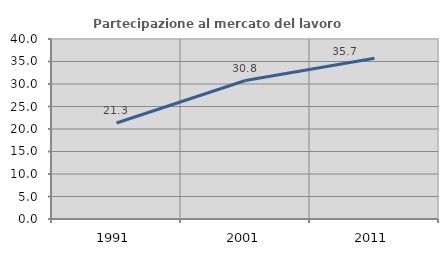
| Category | Partecipazione al mercato del lavoro  femminile |
|---|---|
| 1991.0 | 21.333 |
| 2001.0 | 30.769 |
| 2011.0 | 35.714 |